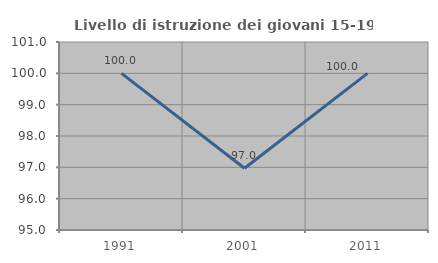
| Category | Livello di istruzione dei giovani 15-19 anni |
|---|---|
| 1991.0 | 100 |
| 2001.0 | 96.97 |
| 2011.0 | 100 |